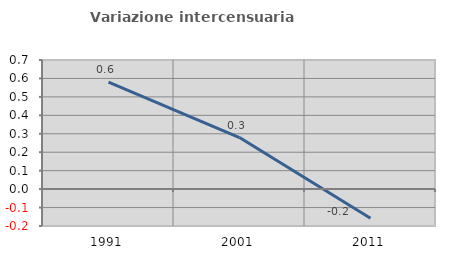
| Category | Variazione intercensuaria annua |
|---|---|
| 1991.0 | 0.581 |
| 2001.0 | 0.279 |
| 2011.0 | -0.158 |